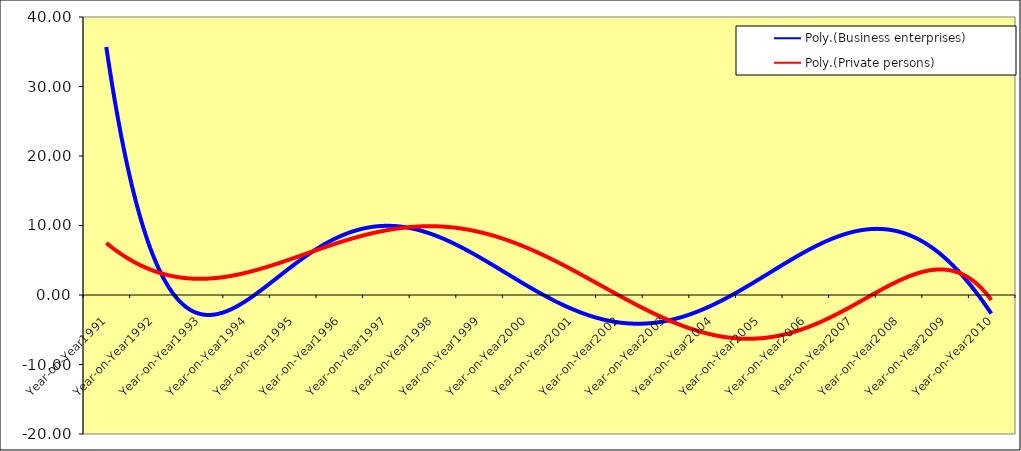
| Category | Business enterprises | Private persons |
|---|---|---|
| Year-on-Year1991 | 36.687 | 6.439 |
| Year-on-Year1992 | 1.374 | 7.267 |
| Year-on-Year1993 | 4.089 | 0.663 |
| Year-on-Year1994 | -5.695 | -2.586 |
| Year-on-Year1995 | 7.335 | 7.351 |
| Year-on-Year1996 | 1.695 | 13.614 |
| Year-on-Year1997 | 29.385 | 10.989 |
| Year-on-Year1998 | -16.196 | 4.457 |
| Year-on-Year1999 | 1.758 | 6.325 |
| Year-on-Year2000 | 27.694 | 8.502 |
| Year-on-Year2001 | -6.29 | 6.481 |
| Year-on-Year2002 | -9.964 | -4.023 |
| Year-on-Year2003 | -11.672 | 3.104 |
| Year-on-Year2004 | -2.639 | -12.178 |
| Year-on-Year2005 | 11.914 | -6.482 |
| Year-on-Year2006 | 14.342 | 5.052 |
| Year-on-Year2007 | -12.274 | -8.594 |
| Year-on-Year2008 | 25.435 | -4.04 |
| Year-on-Year2009 | -1.436 | 12.264 |
| Year-on-Year2010 | -1.449 | -3.419 |